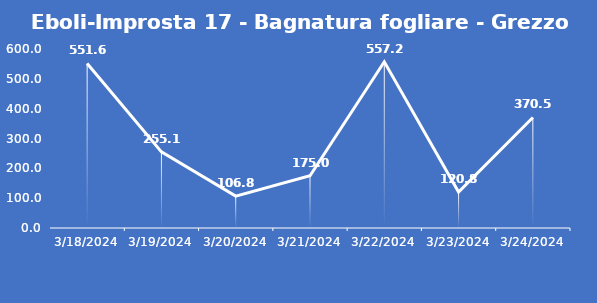
| Category | Eboli-Improsta 17 - Bagnatura fogliare - Grezzo (min) |
|---|---|
| 3/18/24 | 551.6 |
| 3/19/24 | 255.1 |
| 3/20/24 | 106.8 |
| 3/21/24 | 175 |
| 3/22/24 | 557.2 |
| 3/23/24 | 120.8 |
| 3/24/24 | 370.5 |